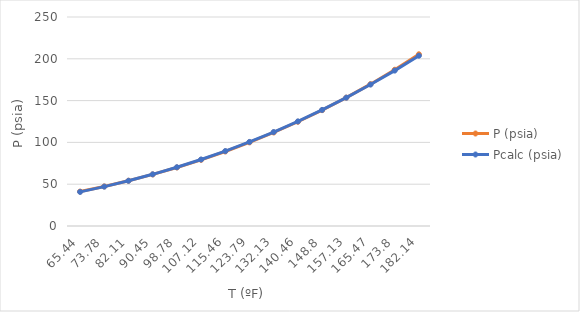
| Category | P (psia) | Pcalc (psia) |
|---|---|---|
| 65.44 | 41.17 | 40.797 |
| 73.78 | 47.32 | 47.115 |
| 82.11 | 54.15 | 54.105 |
| 90.45 | 61.7 | 61.82 |
| 98.78 | 70.02 | 70.279 |
| 107.12 | 79.15 | 79.538 |
| 115.46 | 89.14 | 89.622 |
| 123.79 | 100.03 | 100.551 |
| 132.13 | 111.87 | 112.385 |
| 140.46 | 124.7 | 125.125 |
| 148.8 | 138.58 | 138.831 |
| 157.13 | 153.54 | 153.5 |
| 165.47 | 169.64 | 169.193 |
| 173.8 | 186.9 | 185.897 |
| 182.14 | 205.39 | 203.676 |